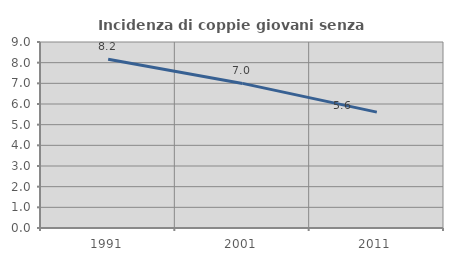
| Category | Incidenza di coppie giovani senza figli |
|---|---|
| 1991.0 | 8.163 |
| 2001.0 | 6.997 |
| 2011.0 | 5.607 |